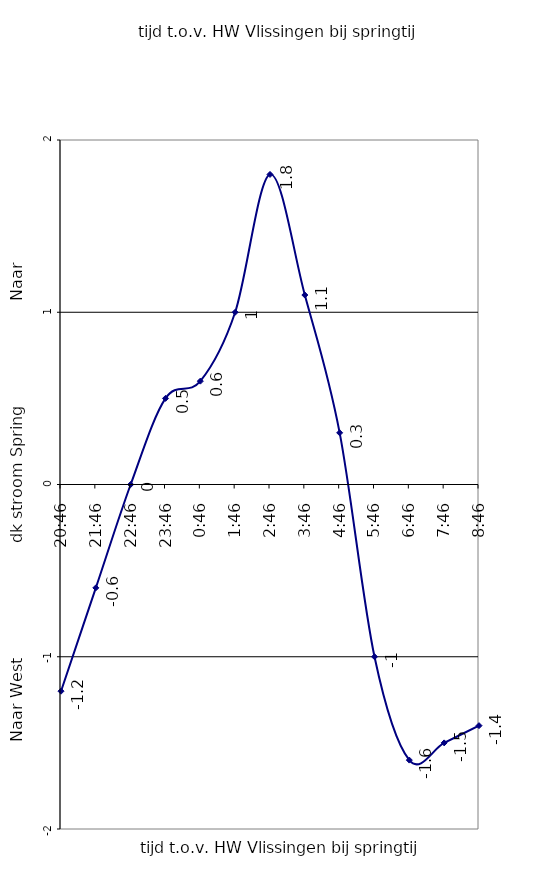
| Category | Series 0 |
|---|---|
| 1900-01-05 20:46:00 | -1.2 |
| 1900-01-04 21:46:00 | -0.6 |
| 1900-01-03 22:46:00 | 0 |
| 1900-01-02 23:46:00 | 0.5 |
| 1900-01-02 00:46:00 | 0.6 |
| 1900-01-01 01:46:00 | 1 |
| 0.11527777777777777 | 1.8 |
| 1900-01-01 03:46:00 | 1.1 |
| 1900-01-02 04:46:00 | 0.3 |
| 1900-01-03 05:46:00 | -1 |
| 1900-01-04 06:46:00 | -1.6 |
| 1900-01-05 07:46:00 | -1.5 |
| 1900-01-06 08:46:00 | -1.4 |